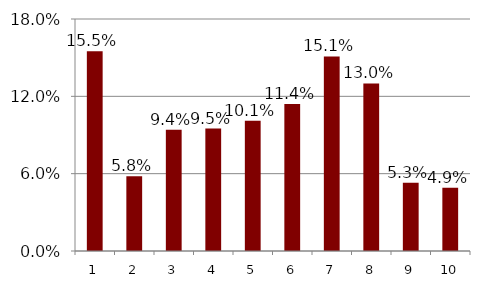
| Category | Series 1 |
|---|---|
| 1.0 | 0.155 |
| 2.0 | 0.058 |
| 3.0 | 0.094 |
| 4.0 | 0.095 |
| 5.0 | 0.101 |
| 6.0 | 0.114 |
| 7.0 | 0.151 |
| 8.0 | 0.13 |
| 9.0 | 0.053 |
| 10.0 | 0.049 |